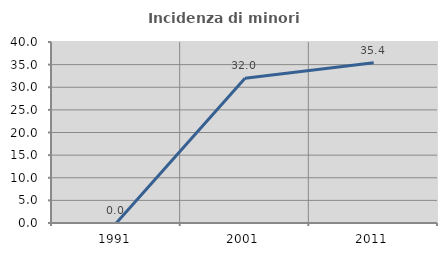
| Category | Incidenza di minori stranieri |
|---|---|
| 1991.0 | 0 |
| 2001.0 | 32 |
| 2011.0 | 35.417 |